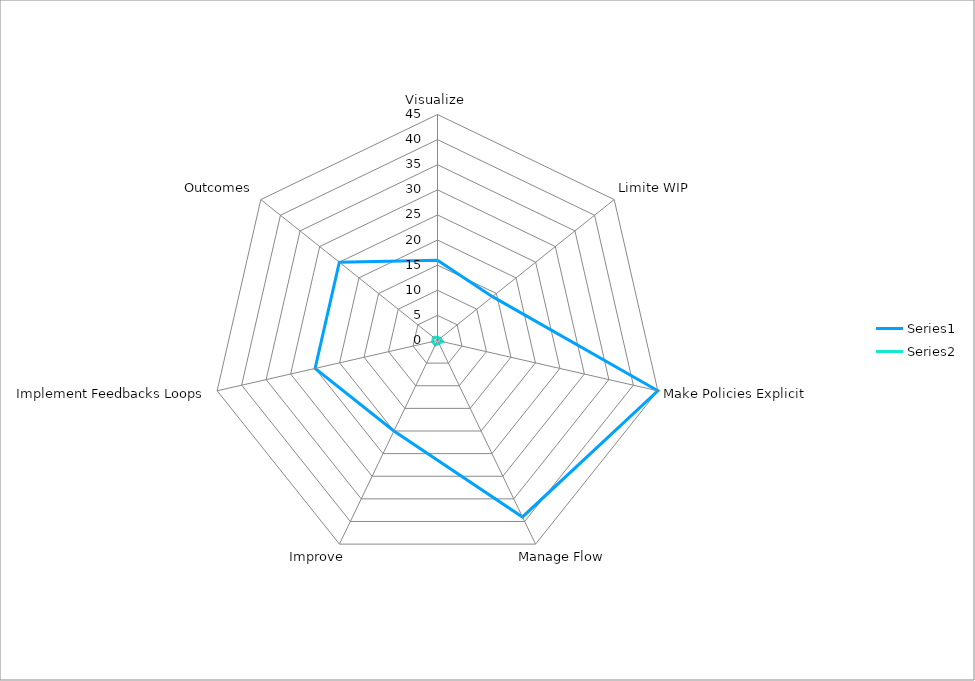
| Category | Series 0 | Series 1 |
|---|---|---|
| Visualize | 16 | 0.64 |
| Limite WIP | 14 | 0.7 |
| Make Policies Explicit | 45 | 1 |
| Manage Flow | 39 | 0.65 |
| Improve | 20 | 1 |
| Implement Feedbacks Loops | 25 | 1 |
| Outcomes | 25 | 1 |